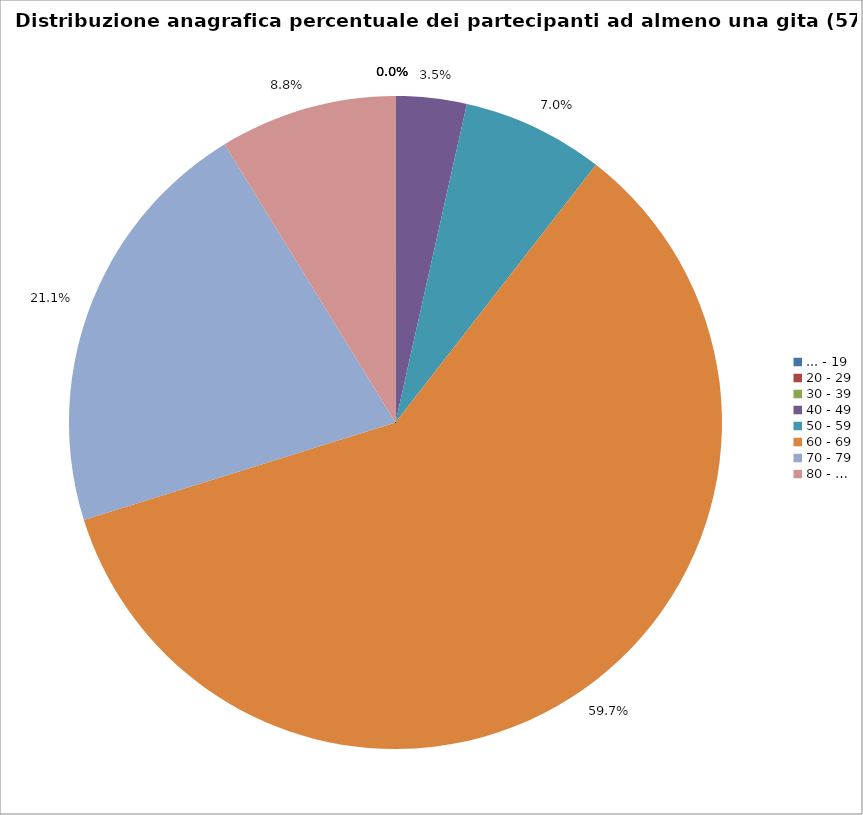
| Category | Nr. Tesserati |
|---|---|
| ... - 19 | 0 |
| 20 - 29 | 0 |
| 30 - 39 | 0 |
| 40 - 49 | 2 |
| 50 - 59 | 4 |
| 60 - 69 | 34 |
| 70 - 79 | 12 |
| 80 - … | 5 |